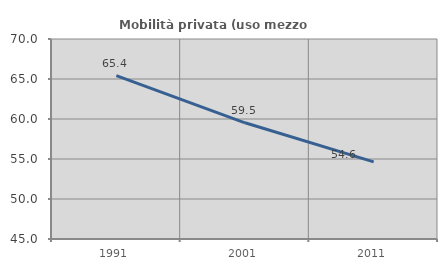
| Category | Mobilità privata (uso mezzo privato) |
|---|---|
| 1991.0 | 65.432 |
| 2001.0 | 59.524 |
| 2011.0 | 54.639 |